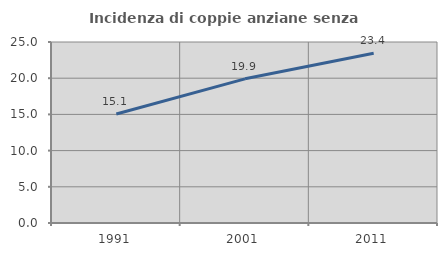
| Category | Incidenza di coppie anziane senza figli  |
|---|---|
| 1991.0 | 15.06 |
| 2001.0 | 19.913 |
| 2011.0 | 23.441 |